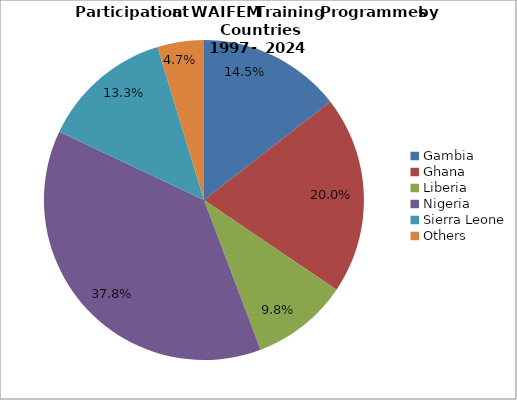
| Category | Series 0 |
|---|---|
| Gambia | 0.145 |
| Ghana | 0.2 |
| Liberia | 0.098 |
| Nigeria | 0.378 |
| Sierra Leone | 0.133 |
| Others | 0.047 |